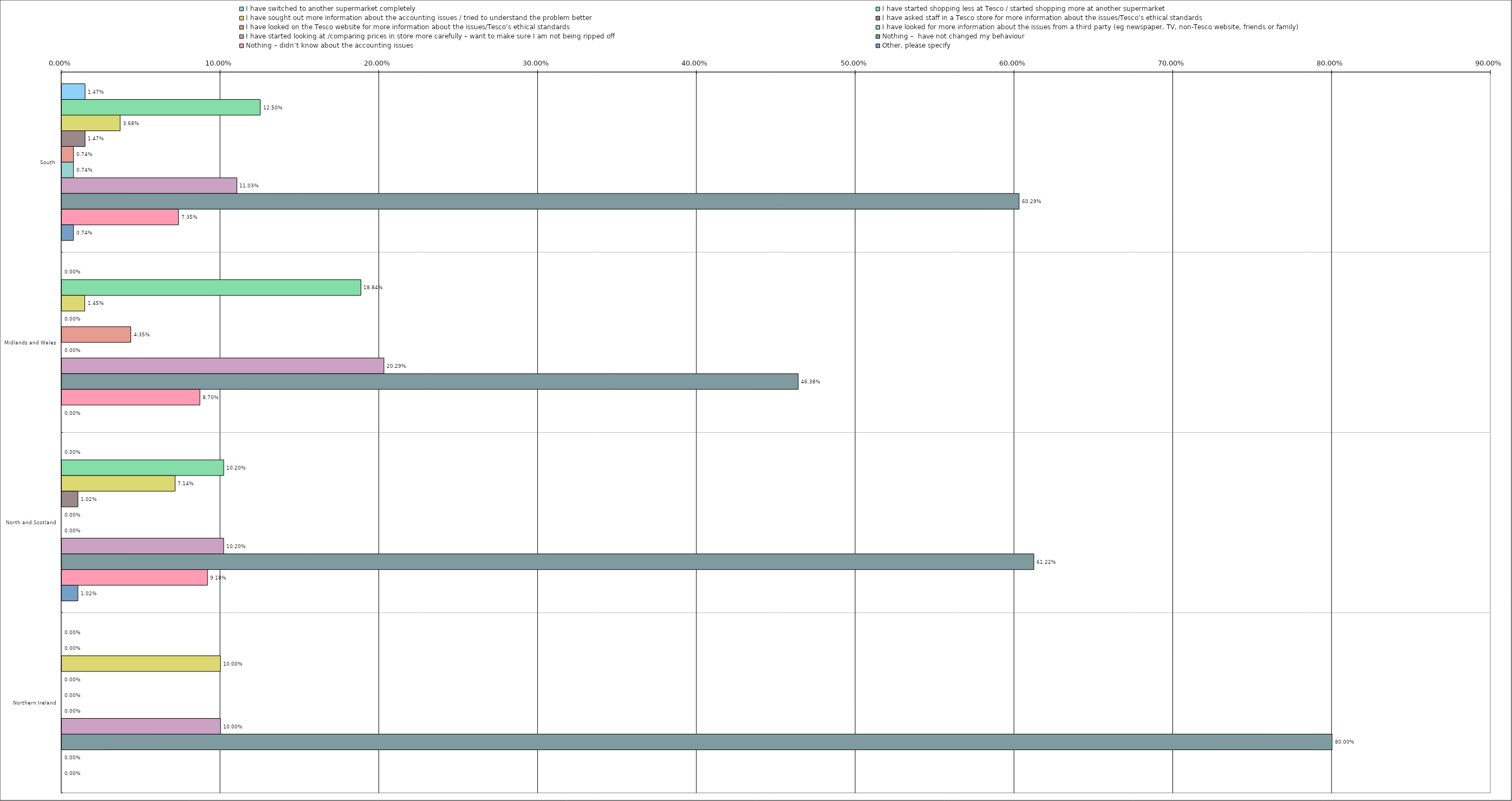
| Category | I have switched to another supermarket completely | I have started shopping less at Tesco / started shopping more at another supermarket | I have sought out more information about the accounting issues / tried to understand the problem better | I have asked staff in a Tesco store for more information about the issues/Tesco’s ethical standards | I have looked on the Tesco website for more information about the issues/Tesco’s ethical standards | I have looked for more information about the issues from a third party (eg newspaper, TV, non-Tesco website, friends or family) | I have started looking at /comparing prices in store more carefully – want to make sure I am not being ripped off | Nothing –  have not changed my behaviour | Nothing – didn’t know about the accounting issues | Other, please specify |
|---|---|---|---|---|---|---|---|---|---|---|
| 0 | 0.015 | 0.125 | 0.037 | 0.015 | 0.007 | 0.007 | 0.11 | 0.603 | 0.074 | 0.007 |
| 1 | 0 | 0.188 | 0.014 | 0 | 0.044 | 0 | 0.203 | 0.464 | 0.087 | 0 |
| 2 | 0 | 0.102 | 0.071 | 0.01 | 0 | 0 | 0.102 | 0.612 | 0.092 | 0.01 |
| 3 | 0 | 0 | 0.1 | 0 | 0 | 0 | 0.1 | 0.8 | 0 | 0 |